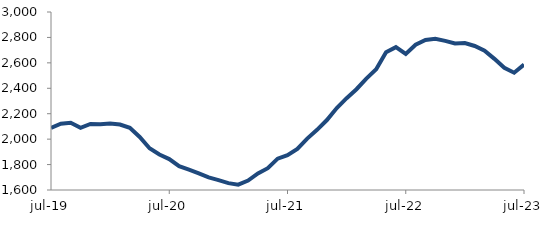
| Category | Series 0 |
|---|---|
| 2019-07-01 | 2089.152 |
| 2019-08-01 | 2121.901 |
| 2019-09-01 | 2128.491 |
| 2019-10-01 | 2088.553 |
| 2019-11-01 | 2119.211 |
| 2019-12-01 | 2116.27 |
| 2020-01-01 | 2123.179 |
| 2020-02-01 | 2115.217 |
| 2020-03-01 | 2088.6 |
| 2020-04-01 | 2017.241 |
| 2020-05-01 | 1928.116 |
| 2020-06-01 | 1878.979 |
| 2020-07-01 | 1843.29 |
| 2020-08-01 | 1787.543 |
| 2020-09-01 | 1760.281 |
| 2020-10-01 | 1731.197 |
| 2020-11-01 | 1698.835 |
| 2020-12-01 | 1677.184 |
| 2021-01-01 | 1654.072 |
| 2021-02-01 | 1641.869 |
| 2021-03-01 | 1673.821 |
| 2021-04-01 | 1730.759 |
| 2021-05-01 | 1771.425 |
| 2021-06-01 | 1846.573 |
| 2021-07-01 | 1874.111 |
| 2021-08-01 | 1922.894 |
| 2021-09-01 | 2004.225 |
| 2021-10-01 | 2073.331 |
| 2021-11-01 | 2150.314 |
| 2021-12-01 | 2244.492 |
| 2022-01-01 | 2321.95 |
| 2022-02-01 | 2392.65 |
| 2022-03-01 | 2476.383 |
| 2022-04-01 | 2549.069 |
| 2022-05-01 | 2683.336 |
| 2022-06-01 | 2723.868 |
| 2022-07-01 | 2670.585 |
| 2022-08-01 | 2742.913 |
| 2022-09-01 | 2780.46 |
| 2022-10-01 | 2788.916 |
| 2022-11-01 | 2772.628 |
| 2022-12-01 | 2752.307 |
| 2023-01-01 | 2755.69 |
| 2023-02-01 | 2732.653 |
| 2023-03-01 | 2696.107 |
| 2023-04-01 | 2631.454 |
| 2023-05-01 | 2561.826 |
| 2023-06-01 | 2522.703 |
| 2023-07-01 | 2586.296 |